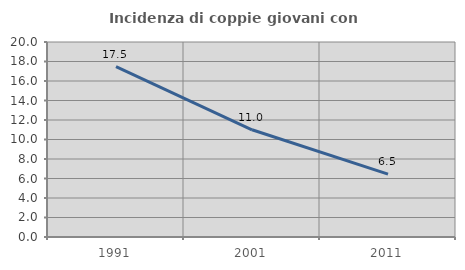
| Category | Incidenza di coppie giovani con figli |
|---|---|
| 1991.0 | 17.471 |
| 2001.0 | 10.997 |
| 2011.0 | 6.452 |